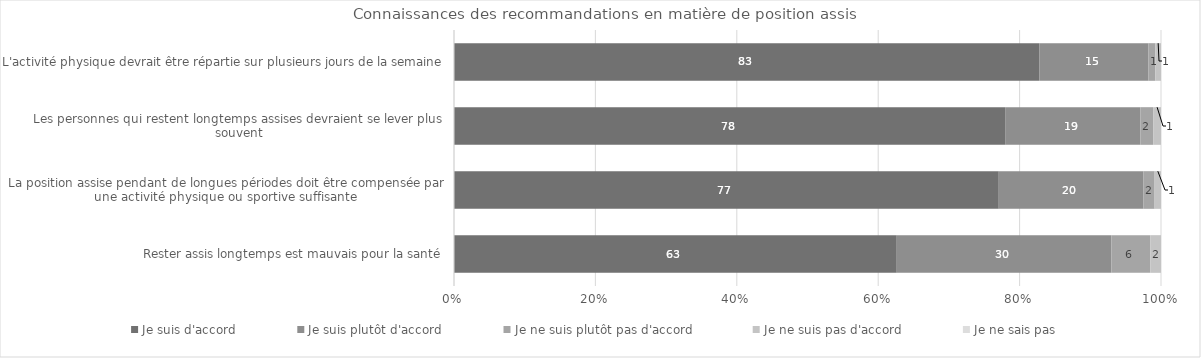
| Category | Je suis d'accord | Je suis plutôt d'accord | Je ne suis plutôt pas d'accord | Je ne suis pas d'accord | Je ne sais pas |
|---|---|---|---|---|---|
| L'activité physique devrait être répartie sur plusieurs jours de la semaine | 82.7 | 15.4 | 1 | 0.8 | 0 |
| Les personnes qui restent longtemps assises devraient se lever plus souvent | 77.8 | 19.1 | 1.8 | 1.1 | 0 |
| La position assise pendant de longues périodes doit être compensée par une activité physique ou sportive suffisante | 76.9 | 20.4 | 1.6 | 0.9 | 0 |
| Rester assis longtemps est mauvais pour la santé | 62.5 | 30.3 | 5.5 | 1.5 | 0 |